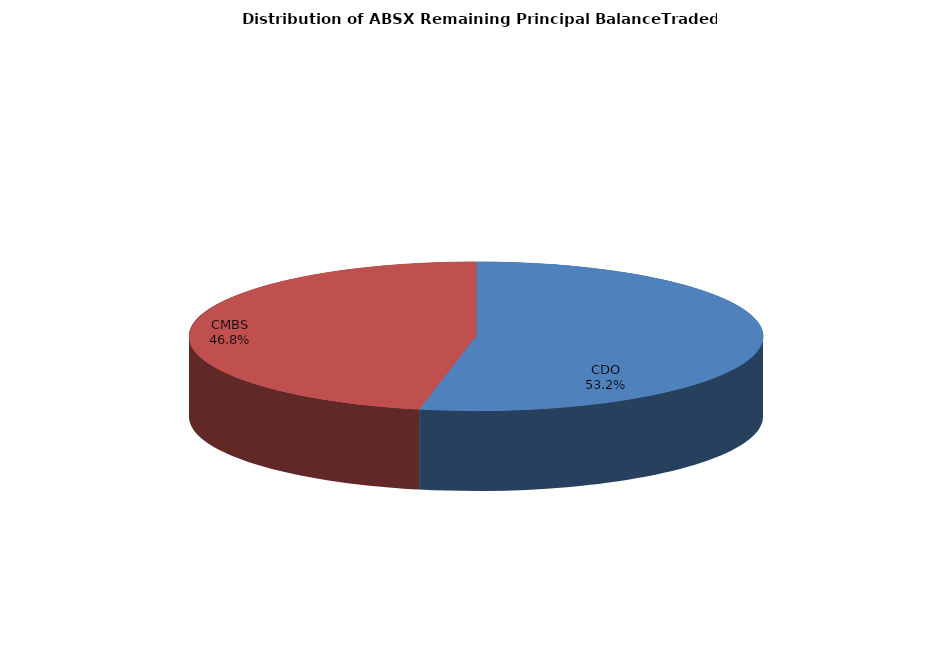
| Category | Series 0 |
|---|---|
| CDO | 1485291098.942 |
| CMBS | 1309165135.025 |